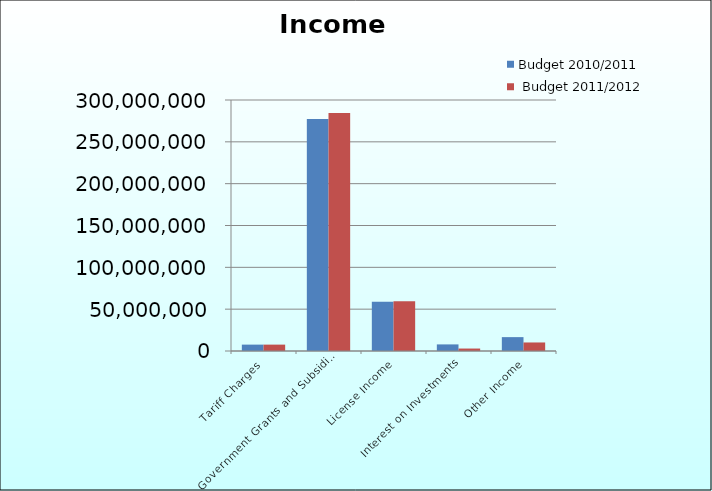
| Category | Budget 2010/2011 |  Budget 2011/2012 |
|---|---|---|
| Tariff Charges  | 7623240 | 7625292 |
| Government Grants and Subsidies | 277398000 | 284594000 |
| License Income | 58728000 | 59562029 |
| Interest on Investments | 7885260 | 2939301 |
| Other Income | 16580371 | 10195298 |